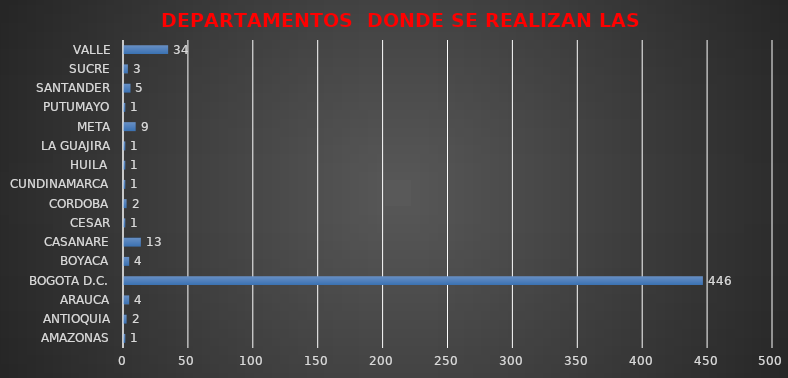
| Category | DEPARTAMENTO 3º TRIMESTRE DE  2020 |
|---|---|
| AMAZONAS | 1 |
| ANTIOQUIA | 2 |
| ARAUCA | 4 |
| BOGOTA D.C. | 446 |
| BOYACA | 4 |
| CASANARE | 13 |
| CESAR | 1 |
| CORDOBA | 2 |
| CUNDINAMARCA | 1 |
| HUILA  | 1 |
| LA GUAJIRA | 1 |
| META | 9 |
| PUTUMAYO | 1 |
| SANTANDER | 5 |
| SUCRE | 3 |
| VALLE | 34 |